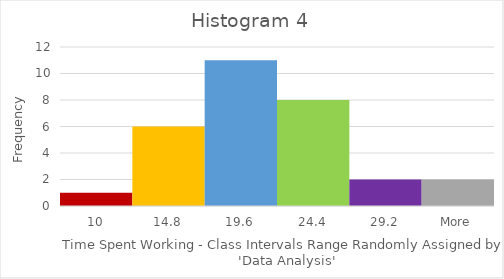
| Category | Frequency |
|---|---|
| 10 | 1 |
| 14.8 | 6 |
| 19.6 | 11 |
| 24.4 | 8 |
| 29.2 | 2 |
| More | 2 |